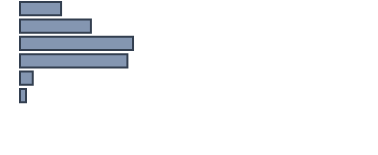
| Category | Series 0 |
|---|---|
| 0 | 11.7 |
| 1 | 20.2 |
| 2 | 32.2 |
| 3 | 30.6 |
| 4 | 3.6 |
| 5 | 1.7 |
| 6 | 0 |
| 7 | 0 |